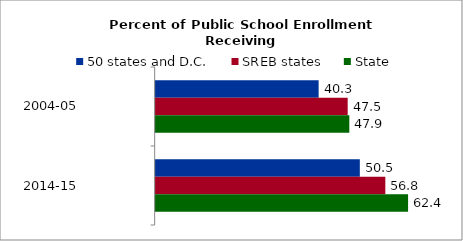
| Category | 50 states and D.C. | SREB states | State |
|---|---|---|---|
| 2004-05 | 40.295 | 47.476 | 47.881 |
| 2014-15 | 50.479 | 56.784 | 62.409 |